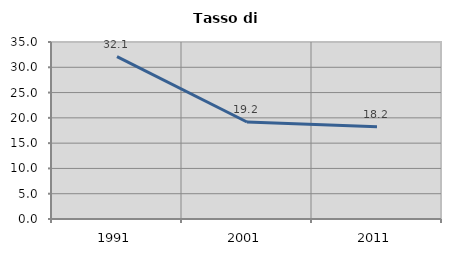
| Category | Tasso di disoccupazione   |
|---|---|
| 1991.0 | 32.094 |
| 2001.0 | 19.182 |
| 2011.0 | 18.245 |